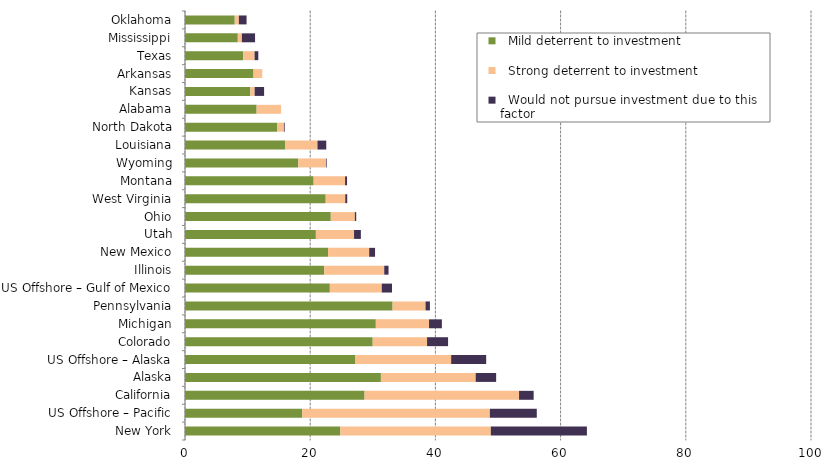
| Category |   Mild deterrent to investment |   Strong deterrent to investment |   Would not pursue investment due to this factor |
|---|---|---|---|
| New York | 24.811 | 24.044 | 15.347 |
| US Offshore – Pacific | 18.732 | 29.971 | 7.493 |
| California | 28.682 | 24.68 | 2.335 |
| Alaska | 31.296 | 15.136 | 3.273 |
| US Offshore – Alaska | 27.226 | 15.291 | 5.594 |
| Colorado | 29.984 | 8.683 | 3.357 |
| Michigan | 30.483 | 8.5 | 2.052 |
| Pennsylvania | 33.16 | 5.263 | 0.702 |
| US Offshore – Gulf of Mexico | 23.137 | 8.297 | 1.636 |
| Illinois | 22.244 | 9.582 | 0.684 |
| New Mexico | 22.848 | 6.573 | 0.939 |
|  Utah | 20.907 | 6.098 | 1.089 |
|  Ohio | 23.29 | 3.846 | 0.214 |
| West Virginia | 22.479 | 3.122 | 0.312 |
|  Montana | 20.552 | 5.02 | 0.314 |
|  Wyoming | 18.103 | 4.418 | 0.108 |
| Louisiana | 16.028 | 5.132 | 1.406 |
| North Dakota | 14.698 | 1.102 | 0.122 |
| Alabama | 11.443 | 3.901 | 0 |
| Kansas | 10.438 | 0.687 | 1.511 |
| Arkansas | 10.943 | 1.397 | 0 |
|  Texas | 9.289 | 1.826 | 0.595 |
|  Mississippi | 8.434 | 0.649 | 2.109 |
|  Oklahoma | 7.945 | 0.662 | 1.23 |